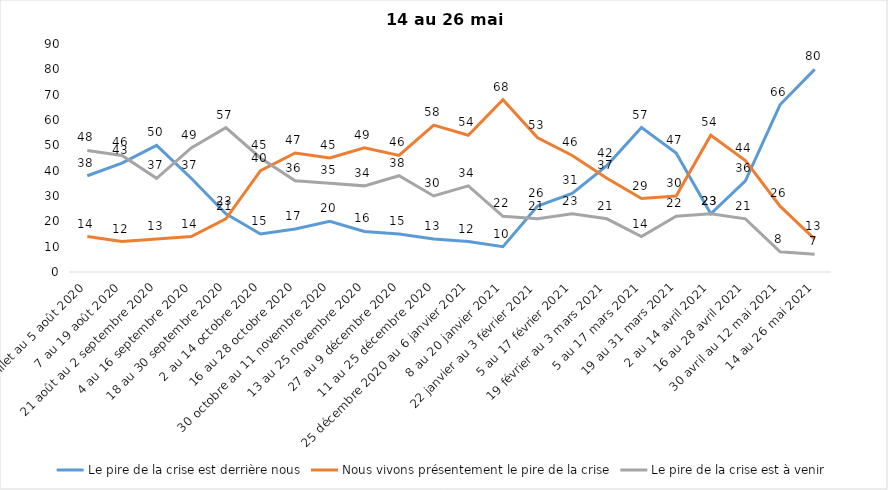
| Category | Le pire de la crise est derrière nous | Nous vivons présentement le pire de la crise | Le pire de la crise est à venir |
|---|---|---|---|
| 24 juillet au 5 août 2020 | 38 | 14 | 48 |
| 7 au 19 août 2020 | 43 | 12 | 46 |
| 21 août au 2 septembre 2020 | 50 | 13 | 37 |
| 4 au 16 septembre 2020 | 37 | 14 | 49 |
| 18 au 30 septembre 2020 | 23 | 21 | 57 |
| 2 au 14 octobre 2020 | 15 | 40 | 45 |
| 16 au 28 octobre 2020 | 17 | 47 | 36 |
| 30 octobre au 11 novembre 2020 | 20 | 45 | 35 |
| 13 au 25 novembre 2020 | 16 | 49 | 34 |
| 27 au 9 décembre 2020 | 15 | 46 | 38 |
| 11 au 25 décembre 2020 | 13 | 58 | 30 |
| 25 décembre 2020 au 6 janvier 2021 | 12 | 54 | 34 |
| 8 au 20 janvier 2021 | 10 | 68 | 22 |
| 22 janvier au 3 février 2021 | 26 | 53 | 21 |
| 5 au 17 février 2021 | 31 | 46 | 23 |
| 19 février au 3 mars 2021 | 42 | 37 | 21 |
| 5 au 17 mars 2021 | 57 | 29 | 14 |
| 19 au 31 mars 2021 | 47 | 30 | 22 |
| 2 au 14 avril 2021 | 23 | 54 | 23 |
| 16 au 28 avril 2021 | 36 | 44 | 21 |
| 30 avril au 12 mai 2021 | 66 | 26 | 8 |
| 14 au 26 mai 2021 | 80 | 13 | 7 |